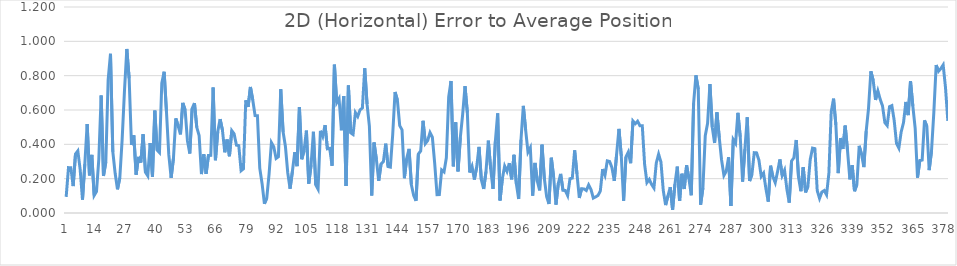
| Category | Series 0 |
|---|---|
| 0 | 0.094 |
| 1 | 0.264 |
| 2 | 0.264 |
| 3 | 0.157 |
| 4 | 0.344 |
| 5 | 0.362 |
| 6 | 0.253 |
| 7 | 0.078 |
| 8 | 0.285 |
| 9 | 0.519 |
| 10 | 0.219 |
| 11 | 0.339 |
| 12 | 0.102 |
| 13 | 0.125 |
| 14 | 0.314 |
| 15 | 0.684 |
| 16 | 0.216 |
| 17 | 0.296 |
| 18 | 0.776 |
| 19 | 0.928 |
| 20 | 0.357 |
| 21 | 0.231 |
| 22 | 0.138 |
| 23 | 0.205 |
| 24 | 0.427 |
| 25 | 0.711 |
| 26 | 0.955 |
| 27 | 0.784 |
| 28 | 0.396 |
| 29 | 0.452 |
| 30 | 0.223 |
| 31 | 0.327 |
| 32 | 0.294 |
| 33 | 0.459 |
| 34 | 0.237 |
| 35 | 0.216 |
| 36 | 0.408 |
| 37 | 0.211 |
| 38 | 0.596 |
| 39 | 0.366 |
| 40 | 0.351 |
| 41 | 0.757 |
| 42 | 0.823 |
| 43 | 0.59 |
| 44 | 0.34 |
| 45 | 0.205 |
| 46 | 0.32 |
| 47 | 0.551 |
| 48 | 0.508 |
| 49 | 0.458 |
| 50 | 0.641 |
| 51 | 0.601 |
| 52 | 0.42 |
| 53 | 0.347 |
| 54 | 0.608 |
| 55 | 0.64 |
| 56 | 0.499 |
| 57 | 0.452 |
| 58 | 0.227 |
| 59 | 0.342 |
| 60 | 0.229 |
| 61 | 0.335 |
| 62 | 0.336 |
| 63 | 0.731 |
| 64 | 0.307 |
| 65 | 0.475 |
| 66 | 0.547 |
| 67 | 0.482 |
| 68 | 0.354 |
| 69 | 0.428 |
| 70 | 0.331 |
| 71 | 0.48 |
| 72 | 0.461 |
| 73 | 0.395 |
| 74 | 0.392 |
| 75 | 0.246 |
| 76 | 0.257 |
| 77 | 0.656 |
| 78 | 0.618 |
| 79 | 0.734 |
| 80 | 0.659 |
| 81 | 0.567 |
| 82 | 0.566 |
| 83 | 0.261 |
| 84 | 0.171 |
| 85 | 0.054 |
| 86 | 0.087 |
| 87 | 0.227 |
| 88 | 0.41 |
| 89 | 0.386 |
| 90 | 0.318 |
| 91 | 0.328 |
| 92 | 0.721 |
| 93 | 0.473 |
| 94 | 0.388 |
| 95 | 0.235 |
| 96 | 0.142 |
| 97 | 0.243 |
| 98 | 0.354 |
| 99 | 0.273 |
| 100 | 0.616 |
| 101 | 0.313 |
| 102 | 0.364 |
| 103 | 0.48 |
| 104 | 0.171 |
| 105 | 0.279 |
| 106 | 0.473 |
| 107 | 0.164 |
| 108 | 0.139 |
| 109 | 0.479 |
| 110 | 0.446 |
| 111 | 0.512 |
| 112 | 0.374 |
| 113 | 0.376 |
| 114 | 0.275 |
| 115 | 0.864 |
| 116 | 0.643 |
| 117 | 0.667 |
| 118 | 0.482 |
| 119 | 0.681 |
| 120 | 0.157 |
| 121 | 0.743 |
| 122 | 0.467 |
| 123 | 0.457 |
| 124 | 0.585 |
| 125 | 0.562 |
| 126 | 0.601 |
| 127 | 0.612 |
| 128 | 0.843 |
| 129 | 0.634 |
| 130 | 0.506 |
| 131 | 0.102 |
| 132 | 0.41 |
| 133 | 0.312 |
| 134 | 0.187 |
| 135 | 0.285 |
| 136 | 0.299 |
| 137 | 0.404 |
| 138 | 0.271 |
| 139 | 0.268 |
| 140 | 0.457 |
| 141 | 0.705 |
| 142 | 0.658 |
| 143 | 0.509 |
| 144 | 0.485 |
| 145 | 0.203 |
| 146 | 0.318 |
| 147 | 0.373 |
| 148 | 0.165 |
| 149 | 0.102 |
| 150 | 0.071 |
| 151 | 0.343 |
| 152 | 0.362 |
| 153 | 0.537 |
| 154 | 0.405 |
| 155 | 0.423 |
| 156 | 0.468 |
| 157 | 0.441 |
| 158 | 0.289 |
| 159 | 0.107 |
| 160 | 0.107 |
| 161 | 0.251 |
| 162 | 0.239 |
| 163 | 0.322 |
| 164 | 0.676 |
| 165 | 0.769 |
| 166 | 0.272 |
| 167 | 0.528 |
| 168 | 0.242 |
| 169 | 0.441 |
| 170 | 0.575 |
| 171 | 0.739 |
| 172 | 0.584 |
| 173 | 0.236 |
| 174 | 0.272 |
| 175 | 0.195 |
| 176 | 0.268 |
| 177 | 0.385 |
| 178 | 0.194 |
| 179 | 0.14 |
| 180 | 0.242 |
| 181 | 0.421 |
| 182 | 0.257 |
| 183 | 0.141 |
| 184 | 0.416 |
| 185 | 0.581 |
| 186 | 0.073 |
| 187 | 0.199 |
| 188 | 0.273 |
| 189 | 0.242 |
| 190 | 0.29 |
| 191 | 0.196 |
| 192 | 0.339 |
| 193 | 0.171 |
| 194 | 0.082 |
| 195 | 0.427 |
| 196 | 0.624 |
| 197 | 0.483 |
| 198 | 0.355 |
| 199 | 0.381 |
| 200 | 0.101 |
| 201 | 0.291 |
| 202 | 0.185 |
| 203 | 0.132 |
| 204 | 0.398 |
| 205 | 0.203 |
| 206 | 0.095 |
| 207 | 0.052 |
| 208 | 0.322 |
| 209 | 0.209 |
| 210 | 0.049 |
| 211 | 0.171 |
| 212 | 0.228 |
| 213 | 0.132 |
| 214 | 0.131 |
| 215 | 0.102 |
| 216 | 0.2 |
| 217 | 0.204 |
| 218 | 0.365 |
| 219 | 0.228 |
| 220 | 0.088 |
| 221 | 0.142 |
| 222 | 0.14 |
| 223 | 0.131 |
| 224 | 0.164 |
| 225 | 0.137 |
| 226 | 0.087 |
| 227 | 0.094 |
| 228 | 0.102 |
| 229 | 0.127 |
| 230 | 0.256 |
| 231 | 0.22 |
| 232 | 0.304 |
| 233 | 0.3 |
| 234 | 0.264 |
| 235 | 0.187 |
| 236 | 0.342 |
| 237 | 0.49 |
| 238 | 0.332 |
| 239 | 0.071 |
| 240 | 0.326 |
| 241 | 0.354 |
| 242 | 0.29 |
| 243 | 0.536 |
| 244 | 0.52 |
| 245 | 0.534 |
| 246 | 0.509 |
| 247 | 0.509 |
| 248 | 0.284 |
| 249 | 0.177 |
| 250 | 0.196 |
| 251 | 0.166 |
| 252 | 0.145 |
| 253 | 0.291 |
| 254 | 0.343 |
| 255 | 0.297 |
| 256 | 0.131 |
| 257 | 0.046 |
| 258 | 0.1 |
| 259 | 0.15 |
| 260 | 0.019 |
| 261 | 0.168 |
| 262 | 0.27 |
| 263 | 0.07 |
| 264 | 0.229 |
| 265 | 0.14 |
| 266 | 0.278 |
| 267 | 0.2 |
| 268 | 0.103 |
| 269 | 0.639 |
| 270 | 0.802 |
| 271 | 0.721 |
| 272 | 0.048 |
| 273 | 0.147 |
| 274 | 0.45 |
| 275 | 0.522 |
| 276 | 0.751 |
| 277 | 0.5 |
| 278 | 0.408 |
| 279 | 0.586 |
| 280 | 0.439 |
| 281 | 0.309 |
| 282 | 0.218 |
| 283 | 0.243 |
| 284 | 0.325 |
| 285 | 0.041 |
| 286 | 0.429 |
| 287 | 0.407 |
| 288 | 0.584 |
| 289 | 0.444 |
| 290 | 0.183 |
| 291 | 0.372 |
| 292 | 0.558 |
| 293 | 0.186 |
| 294 | 0.224 |
| 295 | 0.351 |
| 296 | 0.35 |
| 297 | 0.308 |
| 298 | 0.213 |
| 299 | 0.232 |
| 300 | 0.142 |
| 301 | 0.066 |
| 302 | 0.275 |
| 303 | 0.212 |
| 304 | 0.177 |
| 305 | 0.241 |
| 306 | 0.312 |
| 307 | 0.219 |
| 308 | 0.249 |
| 309 | 0.138 |
| 310 | 0.061 |
| 311 | 0.303 |
| 312 | 0.322 |
| 313 | 0.425 |
| 314 | 0.208 |
| 315 | 0.127 |
| 316 | 0.268 |
| 317 | 0.12 |
| 318 | 0.154 |
| 319 | 0.311 |
| 320 | 0.378 |
| 321 | 0.375 |
| 322 | 0.131 |
| 323 | 0.085 |
| 324 | 0.122 |
| 325 | 0.131 |
| 326 | 0.106 |
| 327 | 0.232 |
| 328 | 0.589 |
| 329 | 0.666 |
| 330 | 0.513 |
| 331 | 0.232 |
| 332 | 0.437 |
| 333 | 0.373 |
| 334 | 0.509 |
| 335 | 0.362 |
| 336 | 0.196 |
| 337 | 0.278 |
| 338 | 0.127 |
| 339 | 0.166 |
| 340 | 0.391 |
| 341 | 0.342 |
| 342 | 0.268 |
| 343 | 0.477 |
| 344 | 0.61 |
| 345 | 0.826 |
| 346 | 0.772 |
| 347 | 0.659 |
| 348 | 0.711 |
| 349 | 0.662 |
| 350 | 0.623 |
| 351 | 0.527 |
| 352 | 0.509 |
| 353 | 0.619 |
| 354 | 0.626 |
| 355 | 0.539 |
| 356 | 0.405 |
| 357 | 0.378 |
| 358 | 0.473 |
| 359 | 0.527 |
| 360 | 0.647 |
| 361 | 0.57 |
| 362 | 0.769 |
| 363 | 0.622 |
| 364 | 0.492 |
| 365 | 0.206 |
| 366 | 0.306 |
| 367 | 0.309 |
| 368 | 0.539 |
| 369 | 0.505 |
| 370 | 0.25 |
| 371 | 0.361 |
| 372 | 0.586 |
| 373 | 0.862 |
| 374 | 0.826 |
| 375 | 0.841 |
| 376 | 0.863 |
| 377 | 0.731 |
| 378 | 0.537 |